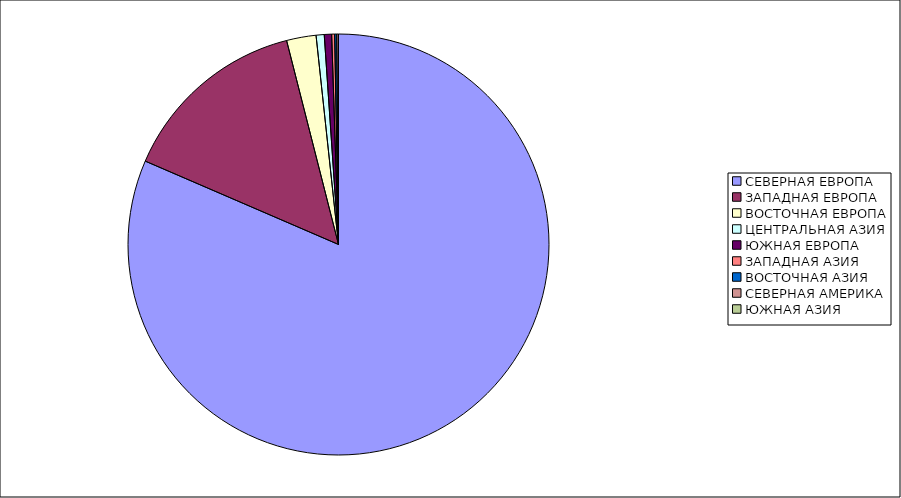
| Category | Оборот |
|---|---|
| СЕВЕРНАЯ ЕВРОПА | 81.483 |
| ЗАПАДНАЯ ЕВРОПА | 14.552 |
| ВОСТОЧНАЯ ЕВРОПА | 2.263 |
| ЦЕНТРАЛЬНАЯ АЗИЯ | 0.622 |
| ЮЖНАЯ ЕВРОПА | 0.561 |
| ЗАПАДНАЯ АЗИЯ | 0.229 |
| ВОСТОЧНАЯ АЗИЯ | 0.16 |
| СЕВЕРНАЯ АМЕРИКА | 0.131 |
| ЮЖНАЯ АЗИЯ | 0 |